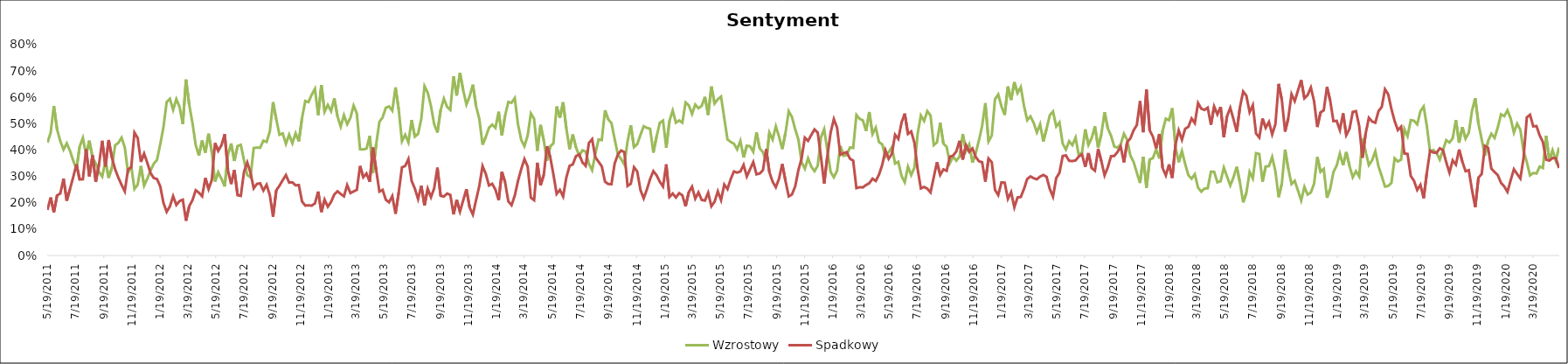
| Category | Wzrostowy | Spadkowy |
|---|---|---|
| 5/19/11 | 0.428 | 0.173 |
| 5/26/11 | 0.465 | 0.22 |
| 6/2/11 | 0.567 | 0.164 |
| 6/9/11 | 0.478 | 0.228 |
| 6/16/11 | 0.434 | 0.235 |
| 6/23/11 | 0.402 | 0.291 |
| 6/30/11 | 0.426 | 0.208 |
| 7/7/11 | 0.397 | 0.252 |
| 7/14/11 | 0.36 | 0.297 |
| 7/21/11 | 0.327 | 0.346 |
| 7/28/11 | 0.413 | 0.288 |
| 8/4/11 | 0.446 | 0.289 |
| 8/11/11 | 0.382 | 0.403 |
| 8/18/11 | 0.436 | 0.3 |
| 8/25/11 | 0.372 | 0.38 |
| 9/1/11 | 0.349 | 0.279 |
| 9/8/11 | 0.317 | 0.345 |
| 9/15/11 | 0.299 | 0.435 |
| 9/22/11 | 0.358 | 0.338 |
| 9/29/11 | 0.295 | 0.438 |
| 10/6/11 | 0.333 | 0.372 |
| 10/13/11 | 0.418 | 0.328 |
| 10/20/11 | 0.427 | 0.295 |
| 10/27/11 | 0.447 | 0.268 |
| 11/3/11 | 0.41 | 0.244 |
| 11/10/11 | 0.315 | 0.327 |
| 11/17/11 | 0.34 | 0.334 |
| 11/24/11 | 0.252 | 0.466 |
| 12/1/11 | 0.269 | 0.446 |
| 12/8/11 | 0.34 | 0.355 |
| 12/15/11 | 0.265 | 0.387 |
| 12/22/11 | 0.292 | 0.351 |
| 12/29/11 | 0.322 | 0.312 |
| 1/5/12 | 0.348 | 0.294 |
| 1/12/12 | 0.363 | 0.29 |
| 1/19/12 | 0.422 | 0.263 |
| 1/26/12 | 0.487 | 0.2 |
| 2/2/12 | 0.583 | 0.166 |
| 2/9/12 | 0.595 | 0.186 |
| 2/16/12 | 0.553 | 0.225 |
| 2/23/12 | 0.593 | 0.192 |
| 3/1/12 | 0.564 | 0.207 |
| 3/8/12 | 0.498 | 0.212 |
| 3/15/12 | 0.668 | 0.132 |
| 3/22/12 | 0.571 | 0.187 |
| 3/29/12 | 0.503 | 0.21 |
| 4/5/12 | 0.419 | 0.248 |
| 4/12/12 | 0.379 | 0.238 |
| 4/19/12 | 0.436 | 0.225 |
| 4/26/12 | 0.39 | 0.294 |
| 5/3/12 | 0.462 | 0.252 |
| 5/10/12 | 0.393 | 0.286 |
| 5/17/12 | 0.28 | 0.427 |
| 5/24/12 | 0.316 | 0.397 |
| 5/31/12 | 0.291 | 0.419 |
| 6/7/12 | 0.262 | 0.46 |
| 6/14/12 | 0.382 | 0.324 |
| 6/21/12 | 0.425 | 0.271 |
| 6/28/12 | 0.359 | 0.324 |
| 7/5/12 | 0.415 | 0.229 |
| 7/12/12 | 0.42 | 0.226 |
| 7/19/12 | 0.36 | 0.318 |
| 7/26/12 | 0.305 | 0.353 |
| 8/2/12 | 0.297 | 0.314 |
| 8/9/12 | 0.408 | 0.255 |
| 8/16/12 | 0.409 | 0.272 |
| 8/23/12 | 0.409 | 0.274 |
| 8/30/12 | 0.436 | 0.246 |
| 9/6/12 | 0.431 | 0.268 |
| 9/13/12 | 0.47 | 0.229 |
| 9/20/12 | 0.582 | 0.147 |
| 9/27/12 | 0.517 | 0.247 |
| 10/4/12 | 0.458 | 0.265 |
| 10/11/12 | 0.463 | 0.286 |
| 10/18/12 | 0.424 | 0.305 |
| 10/25/12 | 0.458 | 0.277 |
| 11/1/12 | 0.426 | 0.278 |
| 11/8/12 | 0.464 | 0.266 |
| 11/15/12 | 0.433 | 0.267 |
| 11/22/12 | 0.522 | 0.205 |
| 11/29/12 | 0.586 | 0.189 |
| 12/6/12 | 0.582 | 0.19 |
| 12/13/12 | 0.61 | 0.189 |
| 12/20/12 | 0.632 | 0.198 |
| 12/27/12 | 0.533 | 0.243 |
| 1/3/13 | 0.647 | 0.165 |
| 1/10/13 | 0.545 | 0.212 |
| 1/17/13 | 0.571 | 0.185 |
| 1/24/13 | 0.548 | 0.203 |
| 1/31/13 | 0.596 | 0.231 |
| 2/7/13 | 0.528 | 0.243 |
| 2/14/13 | 0.489 | 0.233 |
| 2/21/13 | 0.533 | 0.225 |
| 2/28/13 | 0.498 | 0.267 |
| 3/7/13 | 0.522 | 0.237 |
| 3/14/13 | 0.569 | 0.243 |
| 3/21/13 | 0.539 | 0.249 |
| 3/28/13 | 0.403 | 0.34 |
| 4/4/13 | 0.402 | 0.297 |
| 4/11/13 | 0.406 | 0.311 |
| 4/18/13 | 0.453 | 0.28 |
| 4/25/13 | 0.313 | 0.41 |
| 5/2/13 | 0.422 | 0.325 |
| 5/9/13 | 0.507 | 0.242 |
| 5/16/13 | 0.524 | 0.249 |
| 5/23/13 | 0.561 | 0.212 |
| 5/30/13 | 0.566 | 0.202 |
| 6/6/13 | 0.549 | 0.225 |
| 6/13/13 | 0.638 | 0.158 |
| 6/20/13 | 0.553 | 0.24 |
| 6/27/13 | 0.433 | 0.335 |
| 7/4/13 | 0.458 | 0.34 |
| 7/11/13 | 0.429 | 0.366 |
| 7/18/13 | 0.514 | 0.283 |
| 7/25/13 | 0.451 | 0.254 |
| 8/1/13 | 0.462 | 0.214 |
| 8/8/13 | 0.519 | 0.265 |
| 8/15/13 | 0.642 | 0.19 |
| 8/22/13 | 0.618 | 0.253 |
| 8/29/13 | 0.567 | 0.221 |
| 9/5/13 | 0.498 | 0.255 |
| 9/12/13 | 0.467 | 0.333 |
| 9/19/13 | 0.552 | 0.226 |
| 9/26/13 | 0.595 | 0.224 |
| 10/3/13 | 0.564 | 0.235 |
| 10/10/13 | 0.552 | 0.23 |
| 10/17/13 | 0.68 | 0.156 |
| 10/24/13 | 0.607 | 0.211 |
| 10/31/13 | 0.693 | 0.167 |
| 11/7/13 | 0.627 | 0.209 |
| 11/14/13 | 0.573 | 0.252 |
| 11/21/13 | 0.604 | 0.182 |
| 11/28/13 | 0.648 | 0.155 |
| 12/5/13 | 0.566 | 0.211 |
| 12/12/13 | 0.519 | 0.264 |
| 12/19/13 | 0.42 | 0.339 |
| 12/26/13 | 0.45 | 0.31 |
| 1/2/14 | 0.484 | 0.266 |
| 1/9/14 | 0.497 | 0.272 |
| 1/16/14 | 0.484 | 0.25 |
| 1/23/14 | 0.545 | 0.21 |
| 1/30/14 | 0.455 | 0.317 |
| 2/6/14 | 0.531 | 0.278 |
| 2/13/14 | 0.582 | 0.205 |
| 2/20/14 | 0.579 | 0.191 |
| 2/27/14 | 0.597 | 0.227 |
| 3/6/14 | 0.498 | 0.283 |
| 3/13/14 | 0.439 | 0.327 |
| 3/20/14 | 0.415 | 0.366 |
| 3/27/14 | 0.455 | 0.337 |
| 4/3/14 | 0.539 | 0.219 |
| 4/10/14 | 0.519 | 0.21 |
| 4/17/14 | 0.397 | 0.352 |
| 4/24/14 | 0.495 | 0.266 |
| 5/1/14 | 0.437 | 0.306 |
| 5/8/14 | 0.359 | 0.415 |
| 5/15/14 | 0.414 | 0.374 |
| 5/22/14 | 0.425 | 0.307 |
| 5/29/14 | 0.566 | 0.234 |
| 6/5/14 | 0.522 | 0.249 |
| 6/12/14 | 0.581 | 0.224 |
| 6/19/14 | 0.482 | 0.295 |
| 6/26/14 | 0.403 | 0.34 |
| 7/3/14 | 0.459 | 0.345 |
| 7/10/14 | 0.41 | 0.377 |
| 7/17/14 | 0.379 | 0.383 |
| 7/24/14 | 0.399 | 0.353 |
| 7/31/14 | 0.394 | 0.34 |
| 8/7/14 | 0.348 | 0.427 |
| 8/14/14 | 0.324 | 0.441 |
| 8/21/14 | 0.386 | 0.373 |
| 8/28/14 | 0.44 | 0.356 |
| 9/4/14 | 0.438 | 0.338 |
| 9/11/14 | 0.551 | 0.28 |
| 9/18/14 | 0.516 | 0.271 |
| 9/25/14 | 0.502 | 0.271 |
| 10/2/14 | 0.441 | 0.349 |
| 10/9/14 | 0.383 | 0.383 |
| 10/16/14 | 0.366 | 0.398 |
| 10/23/14 | 0.345 | 0.392 |
| 10/30/14 | 0.433 | 0.264 |
| 11/6/14 | 0.494 | 0.272 |
| 11/13/14 | 0.411 | 0.335 |
| 11/20/14 | 0.422 | 0.319 |
| 11/27/14 | 0.457 | 0.248 |
| 12/4/14 | 0.49 | 0.217 |
| 12/11/14 | 0.484 | 0.251 |
| 12/18/14 | 0.481 | 0.29 |
| 12/25/14 | 0.39 | 0.32 |
| 1/1/15 | 0.451 | 0.304 |
| 1/8/15 | 0.503 | 0.28 |
| 1/15/15 | 0.512 | 0.262 |
| 1/22/15 | 0.409 | 0.346 |
| 1/29/15 | 0.511 | 0.222 |
| 2/5/15 | 0.55 | 0.235 |
| 2/12/15 | 0.504 | 0.22 |
| 2/19/15 | 0.512 | 0.236 |
| 2/26/15 | 0.504 | 0.228 |
| 3/5/15 | 0.581 | 0.186 |
| 3/12/15 | 0.57 | 0.241 |
| 3/19/15 | 0.537 | 0.261 |
| 3/26/15 | 0.573 | 0.216 |
| 4/2/15 | 0.559 | 0.239 |
| 4/9/15 | 0.568 | 0.211 |
| 4/16/15 | 0.602 | 0.208 |
| 4/23/15 | 0.533 | 0.238 |
| 4/30/15 | 0.641 | 0.187 |
| 5/7/15 | 0.577 | 0.204 |
| 5/14/15 | 0.593 | 0.243 |
| 5/21/15 | 0.603 | 0.21 |
| 5/28/15 | 0.521 | 0.269 |
| 6/4/15 | 0.44 | 0.252 |
| 6/11/15 | 0.431 | 0.29 |
| 6/18/15 | 0.424 | 0.319 |
| 6/25/15 | 0.403 | 0.314 |
| 7/2/15 | 0.435 | 0.319 |
| 7/9/15 | 0.372 | 0.344 |
| 7/16/15 | 0.416 | 0.3 |
| 7/23/15 | 0.415 | 0.327 |
| 7/30/15 | 0.393 | 0.354 |
| 8/6/15 | 0.467 | 0.308 |
| 8/13/15 | 0.407 | 0.311 |
| 8/20/15 | 0.392 | 0.324 |
| 8/27/15 | 0.357 | 0.403 |
| 9/3/15 | 0.466 | 0.316 |
| 9/10/15 | 0.44 | 0.28 |
| 9/17/15 | 0.49 | 0.259 |
| 9/24/15 | 0.451 | 0.292 |
| 10/1/15 | 0.404 | 0.347 |
| 10/8/15 | 0.466 | 0.283 |
| 10/15/15 | 0.547 | 0.224 |
| 10/22/15 | 0.525 | 0.231 |
| 10/29/15 | 0.479 | 0.262 |
| 11/5/15 | 0.44 | 0.324 |
| 11/12/15 | 0.354 | 0.369 |
| 11/19/15 | 0.329 | 0.447 |
| 11/26/15 | 0.369 | 0.435 |
| 12/3/15 | 0.337 | 0.457 |
| 12/10/15 | 0.32 | 0.478 |
| 12/17/15 | 0.341 | 0.466 |
| 12/24/15 | 0.449 | 0.374 |
| 12/31/15 | 0.479 | 0.273 |
| 1/7/16 | 0.398 | 0.378 |
| 1/14/16 | 0.317 | 0.466 |
| 1/21/16 | 0.297 | 0.517 |
| 1/28/16 | 0.322 | 0.485 |
| 2/4/16 | 0.415 | 0.382 |
| 2/11/16 | 0.378 | 0.388 |
| 2/18/16 | 0.381 | 0.392 |
| 2/25/16 | 0.41 | 0.367 |
| 3/3/16 | 0.408 | 0.36 |
| 3/10/16 | 0.533 | 0.256 |
| 3/17/16 | 0.518 | 0.259 |
| 3/24/16 | 0.513 | 0.258 |
| 3/31/16 | 0.472 | 0.268 |
| 4/7/16 | 0.544 | 0.274 |
| 4/14/16 | 0.461 | 0.292 |
| 4/21/16 | 0.485 | 0.283 |
| 4/28/16 | 0.43 | 0.307 |
| 5/5/16 | 0.422 | 0.343 |
| 5/12/16 | 0.375 | 0.399 |
| 5/19/16 | 0.392 | 0.367 |
| 5/26/16 | 0.411 | 0.386 |
| 6/2/16 | 0.349 | 0.458 |
| 6/9/16 | 0.355 | 0.442 |
| 6/16/16 | 0.302 | 0.504 |
| 6/23/16 | 0.278 | 0.538 |
| 6/30/16 | 0.337 | 0.461 |
| 7/7/16 | 0.305 | 0.471 |
| 7/14/16 | 0.333 | 0.428 |
| 7/21/16 | 0.462 | 0.327 |
| 7/28/16 | 0.531 | 0.254 |
| 8/4/16 | 0.51 | 0.26 |
| 8/11/16 | 0.548 | 0.253 |
| 8/18/16 | 0.531 | 0.239 |
| 8/25/16 | 0.419 | 0.297 |
| 9/1/16 | 0.429 | 0.354 |
| 9/8/16 | 0.504 | 0.306 |
| 9/15/16 | 0.424 | 0.327 |
| 9/22/16 | 0.412 | 0.321 |
| 9/29/16 | 0.351 | 0.375 |
| 10/6/16 | 0.375 | 0.379 |
| 10/13/16 | 0.36 | 0.395 |
| 10/20/16 | 0.375 | 0.435 |
| 10/27/16 | 0.461 | 0.364 |
| 11/3/16 | 0.396 | 0.419 |
| 11/10/16 | 0.421 | 0.394 |
| 11/17/16 | 0.353 | 0.406 |
| 11/24/16 | 0.387 | 0.374 |
| 12/1/16 | 0.436 | 0.358 |
| 12/8/16 | 0.491 | 0.354 |
| 12/15/16 | 0.578 | 0.28 |
| 12/22/16 | 0.433 | 0.368 |
| 12/29/16 | 0.455 | 0.354 |
| 1/5/17 | 0.593 | 0.249 |
| 1/12/17 | 0.611 | 0.229 |
| 1/19/17 | 0.566 | 0.277 |
| 1/26/17 | 0.533 | 0.277 |
| 2/2/17 | 0.641 | 0.215 |
| 2/9/17 | 0.59 | 0.24 |
| 2/16/17 | 0.658 | 0.183 |
| 2/23/17 | 0.616 | 0.22 |
| 3/2/17 | 0.639 | 0.222 |
| 3/9/17 | 0.568 | 0.253 |
| 3/16/17 | 0.513 | 0.29 |
| 3/23/17 | 0.528 | 0.3 |
| 3/30/17 | 0.503 | 0.293 |
| 4/6/17 | 0.467 | 0.289 |
| 4/13/17 | 0.498 | 0.3 |
| 4/20/17 | 0.432 | 0.306 |
| 4/27/17 | 0.481 | 0.298 |
| 5/4/17 | 0.532 | 0.252 |
| 5/11/17 | 0.546 | 0.223 |
| 5/18/17 | 0.49 | 0.294 |
| 5/25/17 | 0.505 | 0.314 |
| 6/1/17 | 0.425 | 0.377 |
| 6/8/17 | 0.402 | 0.38 |
| 6/15/17 | 0.434 | 0.359 |
| 6/22/17 | 0.419 | 0.358 |
| 6/29/17 | 0.447 | 0.361 |
| 7/6/17 | 0.379 | 0.375 |
| 7/13/17 | 0.391 | 0.384 |
| 7/20/17 | 0.479 | 0.336 |
| 7/27/17 | 0.42 | 0.389 |
| 8/3/17 | 0.445 | 0.332 |
| 8/10/17 | 0.49 | 0.322 |
| 8/17/17 | 0.409 | 0.405 |
| 8/24/17 | 0.46 | 0.358 |
| 8/31/17 | 0.544 | 0.304 |
| 9/7/17 | 0.482 | 0.335 |
| 9/14/17 | 0.455 | 0.377 |
| 9/21/17 | 0.413 | 0.378 |
| 9/28/17 | 0.409 | 0.392 |
| 10/5/17 | 0.422 | 0.414 |
| 10/12/17 | 0.462 | 0.353 |
| 10/19/17 | 0.439 | 0.43 |
| 10/26/17 | 0.379 | 0.444 |
| 11/2/17 | 0.355 | 0.475 |
| 11/9/17 | 0.315 | 0.494 |
| 11/16/17 | 0.275 | 0.586 |
| 11/23/17 | 0.375 | 0.467 |
| 11/30/17 | 0.257 | 0.63 |
| 12/7/17 | 0.364 | 0.475 |
| 12/14/17 | 0.369 | 0.451 |
| 12/21/17 | 0.403 | 0.407 |
| 12/28/17 | 0.368 | 0.461 |
| 1/4/18 | 0.473 | 0.332 |
| 1/11/18 | 0.519 | 0.304 |
| 1/18/18 | 0.513 | 0.346 |
| 1/25/18 | 0.559 | 0.294 |
| 2/1/18 | 0.412 | 0.421 |
| 2/8/18 | 0.354 | 0.474 |
| 2/15/18 | 0.396 | 0.439 |
| 2/22/18 | 0.347 | 0.481 |
| 3/1/18 | 0.305 | 0.488 |
| 3/8/18 | 0.291 | 0.52 |
| 3/15/18 | 0.308 | 0.502 |
| 3/22/18 | 0.257 | 0.578 |
| 3/29/18 | 0.242 | 0.557 |
| 4/5/18 | 0.254 | 0.552 |
| 4/12/18 | 0.255 | 0.561 |
| 4/19/18 | 0.318 | 0.496 |
| 4/26/18 | 0.317 | 0.565 |
| 5/3/18 | 0.278 | 0.535 |
| 5/10/18 | 0.282 | 0.564 |
| 5/17/18 | 0.333 | 0.449 |
| 5/24/18 | 0.299 | 0.529 |
| 5/31/18 | 0.266 | 0.56 |
| 6/7/18 | 0.297 | 0.517 |
| 6/14/18 | 0.336 | 0.469 |
| 6/21/18 | 0.277 | 0.562 |
| 6/28/18 | 0.202 | 0.622 |
| 7/5/18 | 0.238 | 0.606 |
| 7/12/18 | 0.317 | 0.543 |
| 7/19/18 | 0.293 | 0.57 |
| 7/26/18 | 0.388 | 0.463 |
| 8/2/18 | 0.385 | 0.448 |
| 8/9/18 | 0.279 | 0.52 |
| 8/16/18 | 0.338 | 0.484 |
| 8/23/18 | 0.339 | 0.507 |
| 8/30/18 | 0.374 | 0.46 |
| 9/6/18 | 0.32 | 0.498 |
| 9/13/18 | 0.221 | 0.651 |
| 9/20/18 | 0.273 | 0.59 |
| 9/27/18 | 0.402 | 0.47 |
| 10/4/18 | 0.329 | 0.521 |
| 10/11/18 | 0.271 | 0.612 |
| 10/18/18 | 0.284 | 0.585 |
| 10/25/18 | 0.247 | 0.626 |
| 11/1/18 | 0.209 | 0.665 |
| 11/8/18 | 0.26 | 0.596 |
| 11/15/18 | 0.231 | 0.609 |
| 11/22/18 | 0.239 | 0.637 |
| 11/29/18 | 0.272 | 0.585 |
| 12/6/18 | 0.374 | 0.487 |
| 12/13/18 | 0.317 | 0.543 |
| 12/20/18 | 0.328 | 0.551 |
| 12/27/18 | 0.219 | 0.639 |
| 1/3/19 | 0.253 | 0.588 |
| 1/10/19 | 0.316 | 0.51 |
| 1/17/19 | 0.341 | 0.511 |
| 1/24/19 | 0.387 | 0.476 |
| 1/31/19 | 0.343 | 0.539 |
| 2/7/19 | 0.392 | 0.457 |
| 2/14/19 | 0.339 | 0.481 |
| 2/21/19 | 0.297 | 0.545 |
| 2/28/19 | 0.32 | 0.548 |
| 3/7/19 | 0.3 | 0.491 |
| 3/14/19 | 0.444 | 0.371 |
| 3/21/19 | 0.394 | 0.463 |
| 3/28/19 | 0.343 | 0.522 |
| 4/4/19 | 0.361 | 0.508 |
| 4/11/19 | 0.396 | 0.504 |
| 4/18/19 | 0.337 | 0.548 |
| 4/25/19 | 0.301 | 0.564 |
| 5/2/19 | 0.261 | 0.631 |
| 5/9/19 | 0.264 | 0.612 |
| 5/16/19 | 0.276 | 0.556 |
| 5/23/19 | 0.369 | 0.51 |
| 5/30/19 | 0.357 | 0.476 |
| 6/6/19 | 0.364 | 0.489 |
| 6/13/19 | 0.48 | 0.387 |
| 6/20/19 | 0.453 | 0.385 |
| 6/27/19 | 0.514 | 0.302 |
| 7/4/19 | 0.511 | 0.283 |
| 7/11/19 | 0.497 | 0.249 |
| 7/18/19 | 0.547 | 0.268 |
| 7/25/19 | 0.565 | 0.217 |
| 8/1/19 | 0.49 | 0.315 |
| 8/8/19 | 0.393 | 0.398 |
| 8/15/19 | 0.4 | 0.391 |
| 8/22/19 | 0.389 | 0.389 |
| 8/29/19 | 0.364 | 0.407 |
| 9/5/19 | 0.4 | 0.4 |
| 9/12/19 | 0.438 | 0.354 |
| 9/19/19 | 0.429 | 0.314 |
| 9/26/19 | 0.444 | 0.361 |
| 10/3/19 | 0.514 | 0.345 |
| 10/10/19 | 0.428 | 0.402 |
| 10/17/19 | 0.487 | 0.356 |
| 10/24/19 | 0.443 | 0.32 |
| 10/31/19 | 0.466 | 0.324 |
| 11/7/19 | 0.549 | 0.249 |
| 11/14/19 | 0.597 | 0.183 |
| 11/21/19 | 0.5 | 0.295 |
| 11/28/19 | 0.441 | 0.309 |
| 12/5/19 | 0.379 | 0.416 |
| 12/12/19 | 0.435 | 0.408 |
| 12/19/19 | 0.462 | 0.33 |
| 12/26/19 | 0.446 | 0.317 |
| 1/2/20 | 0.486 | 0.305 |
| 1/9/20 | 0.536 | 0.276 |
| 1/16/20 | 0.528 | 0.262 |
| 1/23/20 | 0.551 | 0.242 |
| 1/30/20 | 0.519 | 0.286 |
| 2/6/20 | 0.466 | 0.327 |
| 2/13/20 | 0.5 | 0.309 |
| 2/20/20 | 0.477 | 0.292 |
| 2/27/20 | 0.396 | 0.37 |
| 3/5/20 | 0.354 | 0.524 |
| 3/12/20 | 0.304 | 0.534 |
| 3/19/20 | 0.313 | 0.49 |
| 3/26/20 | 0.311 | 0.491 |
| 4/2/20 | 0.337 | 0.455 |
| 4/9/20 | 0.332 | 0.43 |
| 4/16/20 | 0.455 | 0.364 |
| 4/23/20 | 0.36 | 0.36 |
| 4/30/20 | 0.399 | 0.37 |
| 5/7/20 | 0.36 | 0.369 |
| 5/14/20 | 0.41 | 0.332 |